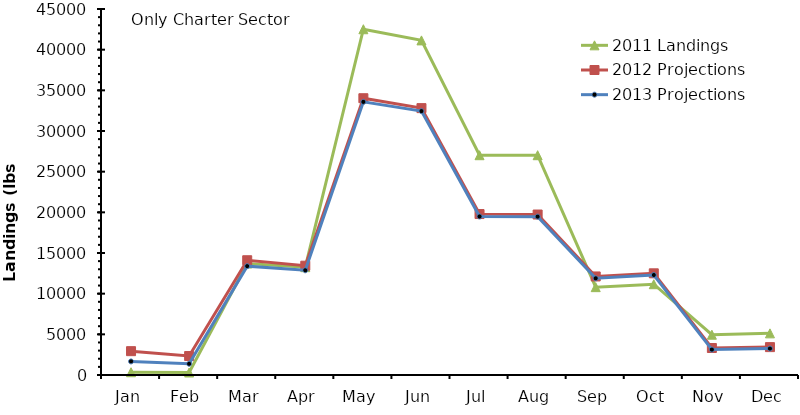
| Category | 2011 Landings | 2012 Projections | 2013 Projections |
|---|---|---|---|
| Jan | 340.485 | 2930.656 | 1669.913 |
| Feb | 307.535 | 2331.228 | 1380.873 |
| Mar | 13698.734 | 14109.978 | 13383.644 |
| Apr | 13256.839 | 13439.382 | 12874.687 |
| May | 42510.895 | 34028.809 | 33580.716 |
| Jun | 41139.576 | 32810.643 | 32446.643 |
| Jul | 27022.92 | 19791.093 | 19487.732 |
| Aug | 27022.92 | 19730.653 | 19471.01 |
| Sep | 10802.124 | 12115.36 | 11887.233 |
| Oct | 11162.195 | 12502.24 | 12296.828 |
| Nov | 4954.467 | 3318.423 | 3129.383 |
| Dec | 5119.616 | 3428.964 | 3251.722 |